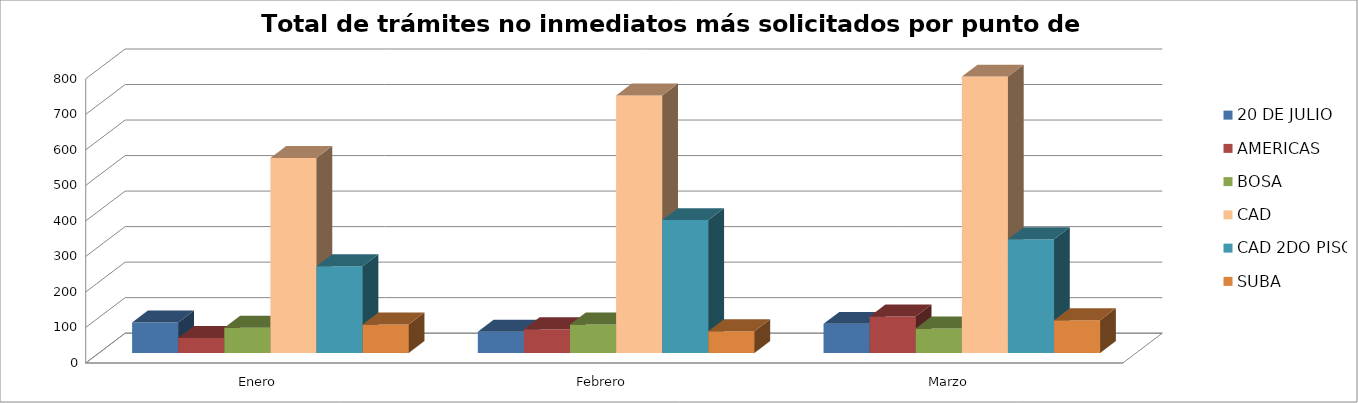
| Category | 20 DE JULIO | AMERICAS | BOSA | CAD | CAD 2DO PISO | SUBA |
|---|---|---|---|---|---|---|
| Enero | 86 | 42 | 71 | 549 | 244 | 80 |
| Febrero | 60 | 67 | 80 | 725 | 374 | 61 |
| Marzo | 82 | 103 | 69 | 778 | 320 | 92 |